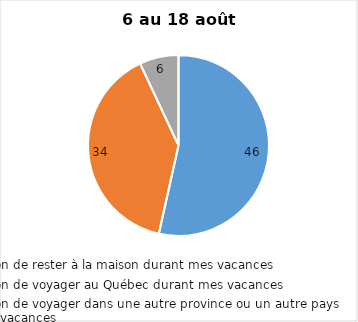
| Category | Series 0 |
|---|---|
| J’ai l’intention de rester à la maison durant mes vacances | 46 |
| J’ai l’intention de voyager au Québec durant mes vacances | 34 |
| J’ai l’intention de voyager dans une autre province ou un autre pays durant mes vacances | 6 |